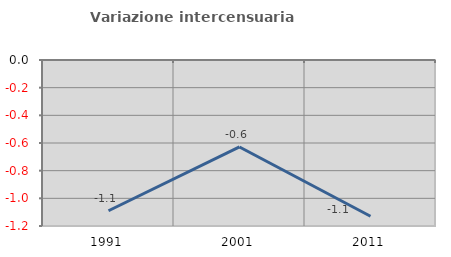
| Category | Variazione intercensuaria annua |
|---|---|
| 1991.0 | -1.09 |
| 2001.0 | -0.629 |
| 2011.0 | -1.129 |